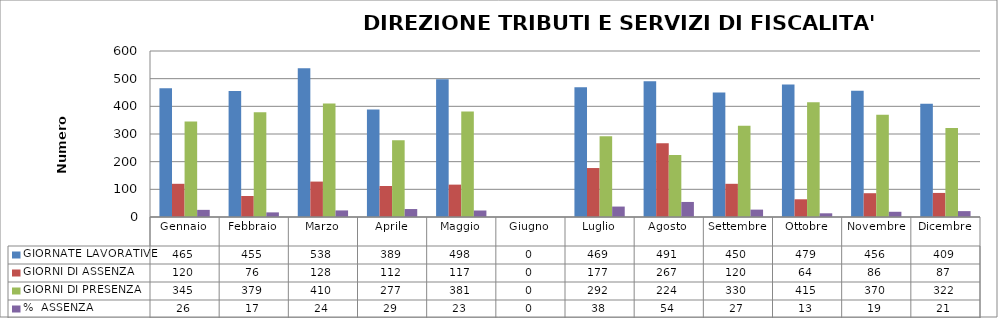
| Category | GIORNATE LAVORATIVE | GIORNI DI ASSENZA | GIORNI DI PRESENZA | %  ASSENZA |
|---|---|---|---|---|
| Gennaio | 465 | 120 | 345 | 25.806 |
| Febbraio | 455 | 76 | 379 | 16.703 |
| Marzo | 538 | 128 | 410 | 23.792 |
| Aprile | 389 | 112 | 277 | 28.792 |
| Maggio | 498 | 117 | 381 | 23.494 |
| Giugno | 0 | 0 | 0 | 0 |
| Luglio | 469 | 177 | 292 | 37.74 |
| Agosto | 491 | 267 | 224 | 54.379 |
| Settembre | 450 | 120 | 330 | 26.667 |
| Ottobre | 479 | 64 | 415 | 13.361 |
| Novembre | 456 | 86 | 370 | 18.86 |
| Dicembre | 409 | 87 | 322 | 21.271 |